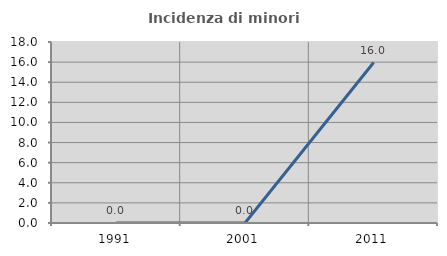
| Category | Incidenza di minori stranieri |
|---|---|
| 1991.0 | 0 |
| 2001.0 | 0 |
| 2011.0 | 15.957 |